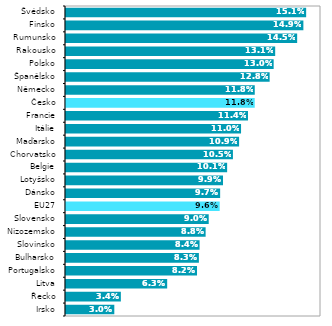
| Category | 2021* |
|---|---|
| Irsko | 0.03 |
| Řecko | 0.034 |
| Litva | 0.063 |
| Portugalsko | 0.082 |
| Bulharsko | 0.083 |
| Slovinsko | 0.084 |
| Nizozemsko | 0.088 |
| Slovensko | 0.09 |
| EU27 | 0.096 |
| Dánsko | 0.097 |
| Lotyšsko | 0.099 |
| Belgie | 0.101 |
| Chorvatsko | 0.105 |
| Maďarsko | 0.109 |
| Itálie | 0.11 |
| Francie | 0.114 |
| Česko | 0.118 |
| Německo | 0.118 |
| Španělsko | 0.128 |
| Polsko | 0.13 |
| Rakousko | 0.131 |
| Rumunsko | 0.145 |
| Finsko | 0.149 |
| Švédsko | 0.151 |